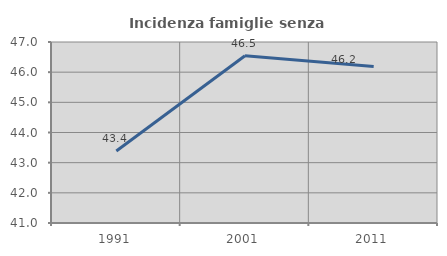
| Category | Incidenza famiglie senza nuclei |
|---|---|
| 1991.0 | 43.387 |
| 2001.0 | 46.544 |
| 2011.0 | 46.187 |